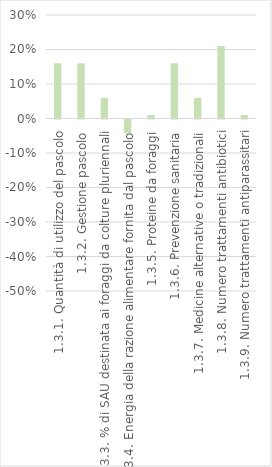
| Category | Series 0 |
|---|---|
| 1.3.1. Quantità di utilizzo del pascolo | 0.16 |
| 1.3.2. Gestione pascolo | 0.16 |
| 1.3.3. % di SAU destinata ai foraggi da colture pluriennali | 0.06 |
| 1.3.4. Energia della razione alimentare fornita dal pascolo | -0.04 |
| 1.3.5. Proteine da foraggi | 0.01 |
| 1.3.6. Prevenzione sanitaria | 0.16 |
| 1.3.7. Medicine alternative o tradizionali | 0.06 |
| 1.3.8. Numero trattamenti antibiotici | 0.21 |
| 1.3.9. Numero trattamenti antiparassitari | 0.01 |